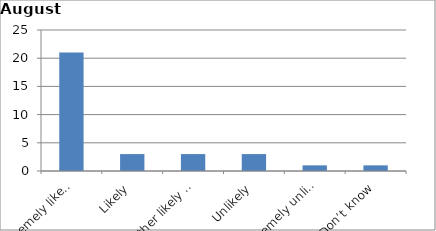
| Category | Series 0 |
|---|---|
| Extremely likely | 21 |
| Likely | 3 |
| Neither likely nor unlikely | 3 |
| Unlikely | 3 |
| Extremely unlikely | 1 |
| Don’t know | 1 |